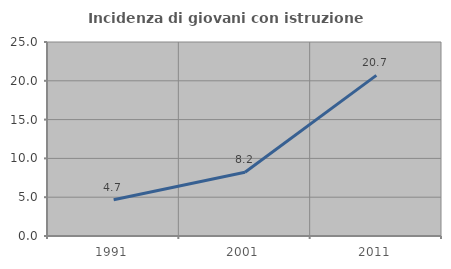
| Category | Incidenza di giovani con istruzione universitaria |
|---|---|
| 1991.0 | 4.673 |
| 2001.0 | 8.207 |
| 2011.0 | 20.703 |